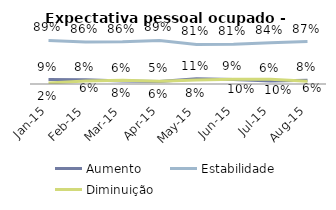
| Category | Aumento | Estabilidade | Diminuição |
|---|---|---|---|
| 2015-01-01 | 0.091 | 0.888 | 0.021 |
| 2015-02-01 | 0.084 | 0.856 | 0.06 |
| 2015-03-01 | 0.06 | 0.861 | 0.079 |
| 2015-04-01 | 0.052 | 0.889 | 0.058 |
| 2015-05-01 | 0.109 | 0.808 | 0.082 |
| 2015-06-01 | 0.092 | 0.811 | 0.097 |
| 2015-07-01 | 0.061 | 0.842 | 0.097 |
| 2015-08-01 | 0.077 | 0.866 | 0.057 |